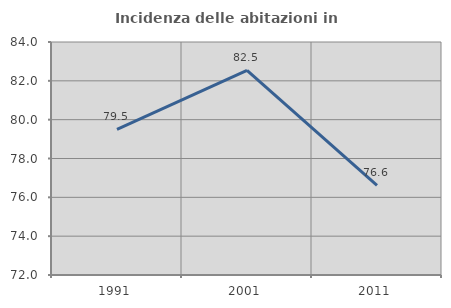
| Category | Incidenza delle abitazioni in proprietà  |
|---|---|
| 1991.0 | 79.5 |
| 2001.0 | 82.533 |
| 2011.0 | 76.617 |